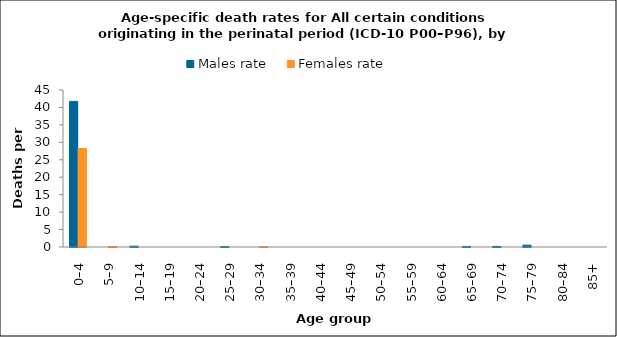
| Category | Males rate | Females rate |
|---|---|---|
| 0–4 | 41.737 | 28.214 |
| 5–9 | 0 | 0.127 |
| 10–14 | 0.239 | 0 |
| 15–19 | 0 | 0 |
| 20–24 | 0 | 0 |
| 25–29 | 0.109 | 0 |
| 30–34 | 0 | 0.104 |
| 35–39 | 0 | 0 |
| 40–44 | 0 | 0 |
| 45–49 | 0 | 0 |
| 50–54 | 0 | 0 |
| 55–59 | 0 | 0 |
| 60–64 | 0 | 0 |
| 65–69 | 0.162 | 0 |
| 70–74 | 0.18 | 0 |
| 75–79 | 0.516 | 0 |
| 80–84 | 0 | 0 |
| 85+ | 0 | 0 |